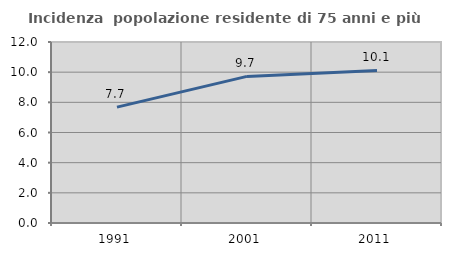
| Category | Incidenza  popolazione residente di 75 anni e più |
|---|---|
| 1991.0 | 7.682 |
| 2001.0 | 9.719 |
| 2011.0 | 10.111 |